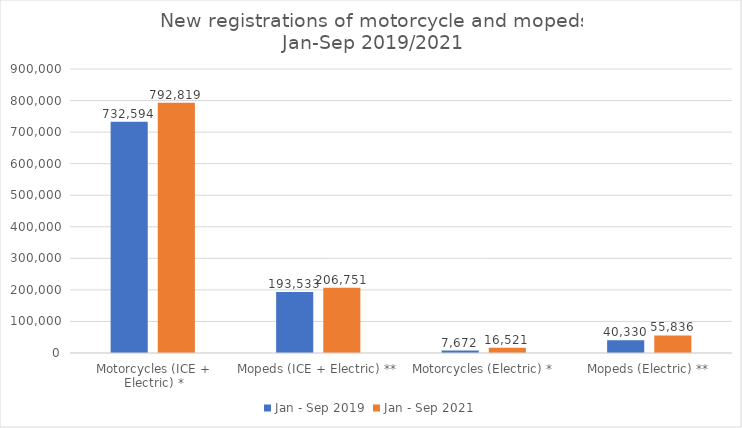
| Category | Jan - Sep 2019 | Jan - Sep 2021 |
|---|---|---|
| Motorcycles (ICE + Electric) * | 732594 | 792819 |
| Mopeds (ICE + Electric) ** | 193533 | 206751 |
| Motorcycles (Electric) * | 7672 | 16521 |
| Mopeds (Electric) ** | 40330 | 55836 |